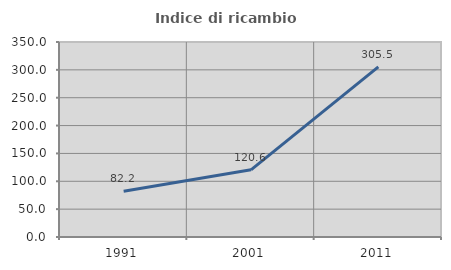
| Category | Indice di ricambio occupazionale  |
|---|---|
| 1991.0 | 82.222 |
| 2001.0 | 120.571 |
| 2011.0 | 305.469 |